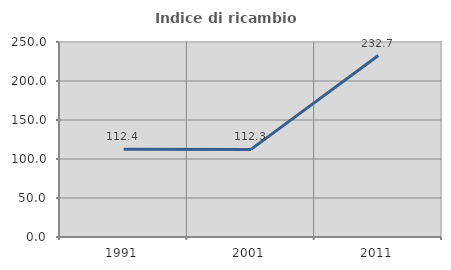
| Category | Indice di ricambio occupazionale  |
|---|---|
| 1991.0 | 112.385 |
| 2001.0 | 112.308 |
| 2011.0 | 232.653 |